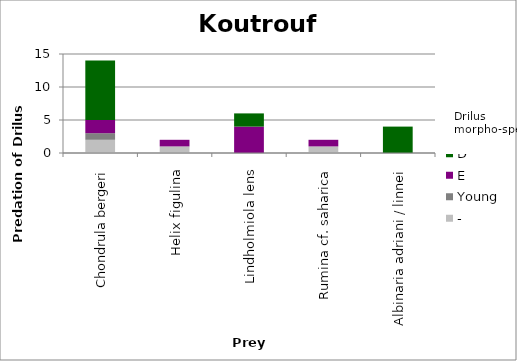
| Category | - | Young | E | D |
|---|---|---|---|---|
| Chondrula bergeri | 2 | 1 | 2 | 9 |
| Helix figulina | 1 | 0 | 1 | 0 |
| Lindholmiola lens | 0 | 0 | 4 | 2 |
| Rumina cf. saharica | 1 | 0 | 1 | 0 |
| Albinaria adriani / linnei | 0 | 0 | 0 | 4 |